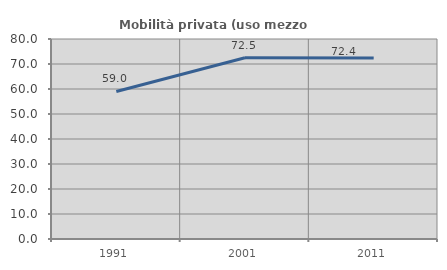
| Category | Mobilità privata (uso mezzo privato) |
|---|---|
| 1991.0 | 59.008 |
| 2001.0 | 72.489 |
| 2011.0 | 72.35 |